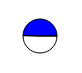
| Category | Series 0 |
|---|---|
| 0 | 7493217 |
| 1 | 7383629 |